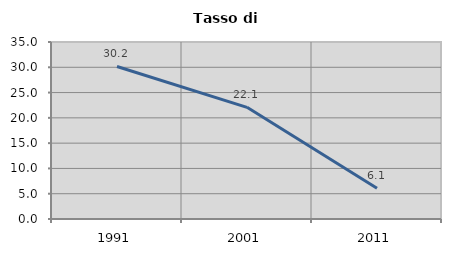
| Category | Tasso di disoccupazione   |
|---|---|
| 1991.0 | 30.159 |
| 2001.0 | 22.078 |
| 2011.0 | 6.093 |